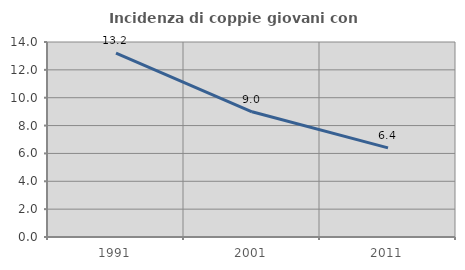
| Category | Incidenza di coppie giovani con figli |
|---|---|
| 1991.0 | 13.202 |
| 2001.0 | 8.991 |
| 2011.0 | 6.4 |